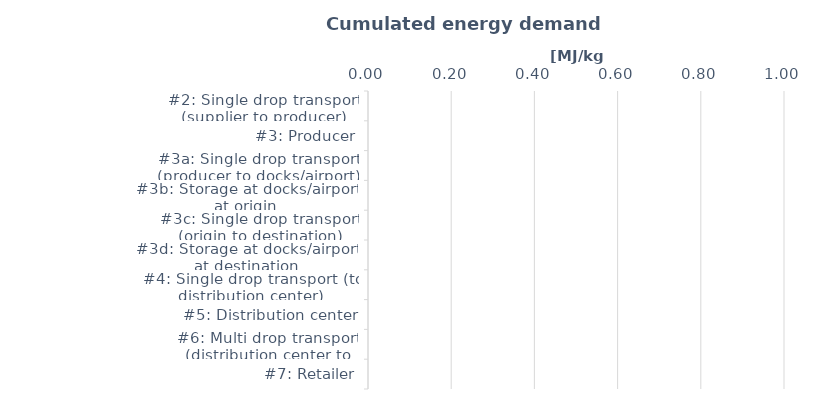
| Category | CED |
|---|---|
| #2: Single drop transport (supplier to producer) | 0 |
| #3: Producer | 0 |
| #3a: Single drop transport (producer to docks/airport) | 0 |
| #3b: Storage at docks/airport at origin | 0 |
| #3c: Single drop transport (origin to destination) | 0 |
| #3d: Storage at docks/airport at destination | 0 |
| #4: Single drop transport (to distribution center) | 0 |
| #5: Distribution center | 0 |
| #6: Multi drop transport (distribution center to retailer) | 0 |
| #7: Retailer | 0 |